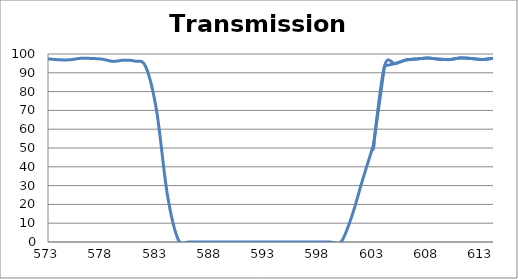
| Category | Transmission (%) |
|---|---|
| 2600.0 | 88.464 |
| 2599.0 | 88.485 |
| 2598.0 | 88.47 |
| 2597.0 | 88.44 |
| 2596.0 | 88.397 |
| 2595.0 | 88.304 |
| 2594.0 | 88.188 |
| 2593.0 | 88.125 |
| 2592.0 | 87.924 |
| 2591.0 | 87.725 |
| 2590.0 | 87.551 |
| 2589.0 | 87.424 |
| 2588.0 | 87.231 |
| 2587.0 | 87.037 |
| 2586.0 | 86.767 |
| 2585.0 | 86.582 |
| 2584.0 | 86.371 |
| 2583.0 | 86.162 |
| 2582.0 | 85.904 |
| 2581.0 | 85.711 |
| 2580.0 | 85.522 |
| 2579.0 | 85.347 |
| 2578.0 | 85.222 |
| 2577.0 | 85.022 |
| 2576.0 | 84.879 |
| 2575.0 | 84.786 |
| 2574.0 | 84.687 |
| 2573.0 | 84.596 |
| 2572.0 | 84.533 |
| 2571.0 | 84.469 |
| 2570.0 | 84.497 |
| 2569.0 | 84.521 |
| 2568.0 | 84.594 |
| 2567.0 | 84.698 |
| 2566.0 | 84.796 |
| 2565.0 | 84.958 |
| 2564.0 | 85.135 |
| 2563.0 | 85.333 |
| 2562.0 | 85.531 |
| 2561.0 | 85.71 |
| 2560.0 | 85.964 |
| 2559.0 | 86.209 |
| 2558.0 | 86.467 |
| 2557.0 | 86.714 |
| 2556.0 | 86.943 |
| 2555.0 | 87.203 |
| 2554.0 | 87.513 |
| 2553.0 | 87.805 |
| 2552.0 | 88.109 |
| 2551.0 | 88.415 |
| 2550.0 | 88.728 |
| 2549.0 | 89.023 |
| 2548.0 | 89.324 |
| 2547.0 | 89.566 |
| 2546.0 | 89.78 |
| 2545.0 | 89.955 |
| 2544.0 | 90.058 |
| 2543.0 | 90.173 |
| 2542.0 | 90.222 |
| 2541.0 | 90.188 |
| 2540.0 | 90.121 |
| 2539.0 | 90.014 |
| 2538.0 | 89.876 |
| 2537.0 | 89.689 |
| 2536.0 | 89.462 |
| 2535.0 | 89.143 |
| 2534.0 | 88.819 |
| 2533.0 | 88.51 |
| 2532.0 | 88.196 |
| 2531.0 | 87.824 |
| 2530.0 | 87.352 |
| 2529.0 | 86.969 |
| 2528.0 | 86.607 |
| 2527.0 | 86.205 |
| 2526.0 | 85.827 |
| 2525.0 | 85.366 |
| 2524.0 | 84.939 |
| 2523.0 | 84.605 |
| 2522.0 | 84.263 |
| 2521.0 | 83.888 |
| 2520.0 | 83.534 |
| 2519.0 | 83.224 |
| 2518.0 | 82.944 |
| 2517.0 | 82.735 |
| 2516.0 | 82.552 |
| 2515.0 | 82.402 |
| 2514.0 | 82.27 |
| 2513.0 | 82.218 |
| 2512.0 | 82.195 |
| 2511.0 | 82.241 |
| 2510.0 | 82.333 |
| 2509.0 | 82.436 |
| 2508.0 | 82.61 |
| 2507.0 | 82.794 |
| 2506.0 | 83.057 |
| 2505.0 | 83.388 |
| 2504.0 | 83.718 |
| 2503.0 | 84.05 |
| 2502.0 | 84.407 |
| 2501.0 | 84.802 |
| 2500.0 | 85.188 |
| 2499.0 | 85.576 |
| 2498.0 | 85.958 |
| 2497.0 | 86.379 |
| 2496.0 | 86.757 |
| 2495.0 | 87.116 |
| 2494.0 | 87.455 |
| 2493.0 | 87.752 |
| 2492.0 | 87.957 |
| 2491.0 | 88.143 |
| 2490.0 | 88.297 |
| 2489.0 | 88.428 |
| 2488.0 | 88.496 |
| 2487.0 | 88.471 |
| 2486.0 | 88.348 |
| 2485.0 | 88.205 |
| 2484.0 | 88.03 |
| 2483.0 | 87.769 |
| 2482.0 | 87.436 |
| 2481.0 | 87.046 |
| 2480.0 | 86.631 |
| 2479.0 | 86.167 |
| 2478.0 | 85.638 |
| 2477.0 | 85.081 |
| 2476.0 | 84.497 |
| 2475.0 | 83.854 |
| 2474.0 | 83.224 |
| 2473.0 | 82.598 |
| 2472.0 | 81.976 |
| 2471.0 | 81.372 |
| 2470.0 | 80.773 |
| 2469.0 | 80.189 |
| 2468.0 | 79.682 |
| 2467.0 | 79.242 |
| 2466.0 | 78.821 |
| 2465.0 | 78.436 |
| 2464.0 | 78.088 |
| 2463.0 | 77.814 |
| 2462.0 | 77.618 |
| 2461.0 | 77.469 |
| 2460.0 | 77.356 |
| 2459.0 | 77.342 |
| 2458.0 | 77.398 |
| 2457.0 | 77.495 |
| 2456.0 | 77.644 |
| 2455.0 | 77.859 |
| 2454.0 | 78.117 |
| 2453.0 | 78.423 |
| 2452.0 | 78.778 |
| 2451.0 | 79.208 |
| 2450.0 | 79.658 |
| 2449.0 | 80.148 |
| 2448.0 | 80.663 |
| 2447.0 | 81.181 |
| 2446.0 | 81.68 |
| 2445.0 | 82.205 |
| 2444.0 | 82.725 |
| 2443.0 | 83.223 |
| 2442.0 | 83.706 |
| 2441.0 | 84.118 |
| 2440.0 | 84.47 |
| 2439.0 | 84.77 |
| 2438.0 | 85.023 |
| 2437.0 | 85.181 |
| 2436.0 | 85.235 |
| 2435.0 | 85.198 |
| 2434.0 | 85.086 |
| 2433.0 | 84.897 |
| 2432.0 | 84.589 |
| 2431.0 | 84.168 |
| 2430.0 | 83.64 |
| 2429.0 | 83.044 |
| 2428.0 | 82.402 |
| 2427.0 | 81.683 |
| 2426.0 | 80.899 |
| 2425.0 | 80.036 |
| 2424.0 | 79.166 |
| 2423.0 | 78.289 |
| 2422.0 | 77.414 |
| 2421.0 | 76.537 |
| 2420.0 | 75.643 |
| 2419.0 | 74.762 |
| 2418.0 | 73.923 |
| 2417.0 | 73.13 |
| 2416.0 | 72.426 |
| 2415.0 | 71.773 |
| 2414.0 | 71.183 |
| 2413.0 | 70.653 |
| 2412.0 | 70.184 |
| 2411.0 | 69.8 |
| 2410.0 | 69.505 |
| 2409.0 | 69.296 |
| 2408.0 | 69.161 |
| 2407.0 | 69.105 |
| 2406.0 | 69.133 |
| 2405.0 | 69.242 |
| 2404.0 | 69.441 |
| 2403.0 | 69.718 |
| 2402.0 | 70.106 |
| 2401.0 | 70.578 |
| 2400.0 | 71.14 |
| 2399.0 | 71.807 |
| 2398.0 | 72.537 |
| 2397.0 | 73.348 |
| 2396.0 | 74.207 |
| 2395.0 | 75.11 |
| 2394.0 | 76.12 |
| 2393.0 | 77.199 |
| 2392.0 | 78.244 |
| 2391.0 | 79.277 |
| 2390.0 | 80.32 |
| 2389.0 | 81.364 |
| 2388.0 | 82.415 |
| 2387.0 | 83.409 |
| 2386.0 | 84.32 |
| 2385.0 | 85.158 |
| 2384.0 | 85.929 |
| 2383.0 | 86.563 |
| 2382.0 | 87.062 |
| 2381.0 | 87.432 |
| 2380.0 | 87.644 |
| 2379.0 | 87.724 |
| 2378.0 | 87.695 |
| 2377.0 | 87.541 |
| 2376.0 | 87.282 |
| 2375.0 | 86.941 |
| 2374.0 | 86.428 |
| 2373.0 | 85.798 |
| 2372.0 | 85.106 |
| 2371.0 | 84.396 |
| 2370.0 | 83.642 |
| 2369.0 | 82.818 |
| 2368.0 | 81.99 |
| 2367.0 | 81.183 |
| 2366.0 | 80.345 |
| 2365.0 | 79.538 |
| 2364.0 | 78.75 |
| 2363.0 | 77.999 |
| 2362.0 | 77.304 |
| 2361.0 | 76.697 |
| 2360.0 | 76.131 |
| 2359.0 | 75.658 |
| 2358.0 | 75.26 |
| 2357.0 | 74.905 |
| 2356.0 | 74.655 |
| 2355.0 | 74.513 |
| 2354.0 | 74.465 |
| 2353.0 | 74.511 |
| 2352.0 | 74.618 |
| 2351.0 | 74.775 |
| 2350.0 | 75.01 |
| 2349.0 | 75.335 |
| 2348.0 | 75.75 |
| 2347.0 | 76.223 |
| 2346.0 | 76.753 |
| 2345.0 | 77.278 |
| 2344.0 | 77.821 |
| 2343.0 | 78.415 |
| 2342.0 | 79.02 |
| 2341.0 | 79.59 |
| 2340.0 | 80.153 |
| 2339.0 | 80.659 |
| 2338.0 | 81.136 |
| 2337.0 | 81.596 |
| 2336.0 | 81.988 |
| 2335.0 | 82.268 |
| 2334.0 | 82.452 |
| 2333.0 | 82.567 |
| 2332.0 | 82.602 |
| 2331.0 | 82.574 |
| 2330.0 | 82.463 |
| 2329.0 | 82.256 |
| 2328.0 | 81.959 |
| 2327.0 | 81.592 |
| 2326.0 | 81.14 |
| 2325.0 | 80.664 |
| 2324.0 | 80.138 |
| 2323.0 | 79.569 |
| 2322.0 | 78.981 |
| 2321.0 | 78.415 |
| 2320.0 | 77.814 |
| 2319.0 | 77.255 |
| 2318.0 | 76.711 |
| 2317.0 | 76.196 |
| 2316.0 | 75.737 |
| 2315.0 | 75.332 |
| 2314.0 | 75.002 |
| 2313.0 | 74.767 |
| 2312.0 | 74.583 |
| 2311.0 | 74.462 |
| 2310.0 | 74.442 |
| 2309.0 | 74.516 |
| 2308.0 | 74.676 |
| 2307.0 | 74.904 |
| 2306.0 | 75.263 |
| 2305.0 | 75.66 |
| 2304.0 | 76.136 |
| 2303.0 | 76.691 |
| 2302.0 | 77.288 |
| 2301.0 | 77.929 |
| 2300.0 | 78.618 |
| 2299.0 | 79.316 |
| 2298.0 | 80.049 |
| 2297.0 | 80.817 |
| 2296.0 | 81.533 |
| 2295.0 | 82.192 |
| 2294.0 | 82.839 |
| 2293.0 | 83.408 |
| 2292.0 | 83.931 |
| 2291.0 | 84.346 |
| 2290.0 | 84.691 |
| 2289.0 | 84.943 |
| 2288.0 | 85.095 |
| 2287.0 | 85.112 |
| 2286.0 | 85.007 |
| 2285.0 | 84.797 |
| 2284.0 | 84.459 |
| 2283.0 | 84.022 |
| 2282.0 | 83.467 |
| 2281.0 | 82.881 |
| 2280.0 | 82.2 |
| 2279.0 | 81.52 |
| 2278.0 | 80.764 |
| 2277.0 | 79.99 |
| 2276.0 | 79.198 |
| 2275.0 | 78.457 |
| 2274.0 | 77.73 |
| 2273.0 | 77.066 |
| 2272.0 | 76.432 |
| 2271.0 | 75.886 |
| 2270.0 | 75.422 |
| 2269.0 | 75.066 |
| 2268.0 | 74.848 |
| 2267.0 | 74.685 |
| 2266.0 | 74.631 |
| 2265.0 | 74.695 |
| 2264.0 | 74.867 |
| 2263.0 | 75.139 |
| 2262.0 | 75.567 |
| 2261.0 | 76.061 |
| 2260.0 | 76.661 |
| 2259.0 | 77.307 |
| 2258.0 | 78.117 |
| 2257.0 | 78.997 |
| 2256.0 | 79.951 |
| 2255.0 | 80.839 |
| 2254.0 | 81.788 |
| 2253.0 | 82.69 |
| 2252.0 | 83.646 |
| 2251.0 | 84.548 |
| 2250.0 | 85.356 |
| 2249.0 | 86.131 |
| 2248.0 | 86.785 |
| 2247.0 | 87.272 |
| 2246.0 | 87.611 |
| 2245.0 | 87.855 |
| 2244.0 | 87.843 |
| 2243.0 | 87.635 |
| 2242.0 | 87.203 |
| 2241.0 | 86.62 |
| 2240.0 | 85.823 |
| 2239.0 | 84.898 |
| 2238.0 | 83.755 |
| 2237.0 | 82.565 |
| 2236.0 | 81.251 |
| 2235.0 | 79.835 |
| 2234.0 | 78.389 |
| 2233.0 | 76.888 |
| 2232.0 | 75.421 |
| 2231.0 | 73.97 |
| 2230.0 | 72.505 |
| 2229.0 | 71.239 |
| 2228.0 | 69.948 |
| 2227.0 | 68.829 |
| 2226.0 | 67.74 |
| 2225.0 | 66.785 |
| 2224.0 | 65.935 |
| 2223.0 | 65.203 |
| 2222.0 | 64.607 |
| 2221.0 | 64.141 |
| 2220.0 | 63.739 |
| 2219.0 | 63.515 |
| 2218.0 | 63.354 |
| 2217.0 | 63.296 |
| 2216.0 | 63.371 |
| 2215.0 | 63.528 |
| 2214.0 | 63.772 |
| 2213.0 | 64.023 |
| 2212.0 | 64.4 |
| 2211.0 | 64.785 |
| 2210.0 | 65.258 |
| 2209.0 | 65.748 |
| 2208.0 | 66.248 |
| 2207.0 | 66.811 |
| 2206.0 | 67.321 |
| 2205.0 | 67.815 |
| 2204.0 | 68.26 |
| 2203.0 | 68.665 |
| 2202.0 | 68.989 |
| 2201.0 | 69.21 |
| 2200.0 | 69.336 |
| 2199.0 | 69.386 |
| 2198.0 | 69.325 |
| 2197.0 | 69.178 |
| 2196.0 | 68.917 |
| 2195.0 | 68.614 |
| 2194.0 | 68.184 |
| 2193.0 | 67.659 |
| 2192.0 | 67.049 |
| 2191.0 | 66.509 |
| 2190.0 | 65.877 |
| 2189.0 | 65.238 |
| 2188.0 | 64.583 |
| 2187.0 | 64.007 |
| 2186.0 | 63.463 |
| 2185.0 | 62.947 |
| 2184.0 | 62.517 |
| 2183.0 | 62.168 |
| 2182.0 | 61.901 |
| 2181.0 | 61.738 |
| 2180.0 | 61.645 |
| 2179.0 | 61.677 |
| 2178.0 | 61.81 |
| 2177.0 | 62.071 |
| 2176.0 | 62.423 |
| 2175.0 | 62.846 |
| 2174.0 | 63.42 |
| 2173.0 | 64.119 |
| 2172.0 | 64.88 |
| 2171.0 | 65.696 |
| 2170.0 | 66.644 |
| 2169.0 | 67.671 |
| 2168.0 | 68.804 |
| 2167.0 | 70.004 |
| 2166.0 | 71.179 |
| 2165.0 | 72.308 |
| 2164.0 | 73.485 |
| 2163.0 | 74.647 |
| 2162.0 | 75.714 |
| 2161.0 | 76.719 |
| 2160.0 | 77.64 |
| 2159.0 | 78.305 |
| 2158.0 | 78.872 |
| 2157.0 | 79.228 |
| 2156.0 | 79.385 |
| 2155.0 | 79.361 |
| 2154.0 | 79.077 |
| 2153.0 | 78.631 |
| 2152.0 | 78.013 |
| 2151.0 | 77.246 |
| 2150.0 | 76.356 |
| 2149.0 | 75.32 |
| 2148.0 | 74.233 |
| 2147.0 | 73.086 |
| 2146.0 | 71.948 |
| 2145.0 | 70.867 |
| 2144.0 | 69.804 |
| 2143.0 | 68.783 |
| 2142.0 | 67.808 |
| 2141.0 | 67.013 |
| 2140.0 | 66.268 |
| 2139.0 | 65.641 |
| 2138.0 | 65.129 |
| 2137.0 | 64.749 |
| 2136.0 | 64.523 |
| 2135.0 | 64.38 |
| 2134.0 | 64.384 |
| 2133.0 | 64.554 |
| 2132.0 | 64.84 |
| 2131.0 | 65.25 |
| 2130.0 | 65.775 |
| 2129.0 | 66.478 |
| 2128.0 | 67.327 |
| 2127.0 | 68.239 |
| 2126.0 | 69.282 |
| 2125.0 | 70.409 |
| 2124.0 | 71.738 |
| 2123.0 | 73.183 |
| 2122.0 | 74.623 |
| 2121.0 | 76.18 |
| 2120.0 | 77.819 |
| 2119.0 | 79.474 |
| 2118.0 | 81.251 |
| 2117.0 | 82.905 |
| 2116.0 | 84.609 |
| 2115.0 | 86.247 |
| 2114.0 | 87.874 |
| 2113.0 | 89.244 |
| 2112.0 | 90.592 |
| 2111.0 | 91.783 |
| 2110.0 | 92.844 |
| 2109.0 | 93.737 |
| 2108.0 | 94.411 |
| 2107.0 | 94.983 |
| 2106.0 | 95.381 |
| 2105.0 | 95.605 |
| 2104.0 | 95.7 |
| 2103.0 | 95.644 |
| 2102.0 | 95.492 |
| 2101.0 | 95.206 |
| 2100.0 | 94.817 |
| 2099.0 | 94.37 |
| 2098.0 | 93.846 |
| 2097.0 | 93.265 |
| 2096.0 | 92.619 |
| 2095.0 | 91.926 |
| 2094.0 | 91.225 |
| 2093.0 | 90.468 |
| 2092.0 | 89.673 |
| 2091.0 | 88.861 |
| 2090.0 | 88.054 |
| 2089.0 | 87.216 |
| 2088.0 | 86.375 |
| 2087.0 | 85.517 |
| 2086.0 | 84.636 |
| 2085.0 | 83.78 |
| 2084.0 | 82.907 |
| 2083.0 | 82.082 |
| 2082.0 | 81.261 |
| 2081.0 | 80.45 |
| 2080.0 | 79.706 |
| 2079.0 | 78.994 |
| 2078.0 | 78.318 |
| 2077.0 | 77.699 |
| 2076.0 | 77.204 |
| 2075.0 | 76.799 |
| 2074.0 | 76.445 |
| 2073.0 | 76.201 |
| 2072.0 | 76.084 |
| 2071.0 | 76.085 |
| 2070.0 | 76.215 |
| 2069.0 | 76.476 |
| 2068.0 | 76.865 |
| 2067.0 | 77.365 |
| 2066.0 | 78.033 |
| 2065.0 | 78.847 |
| 2064.0 | 79.752 |
| 2063.0 | 80.756 |
| 2062.0 | 81.867 |
| 2061.0 | 83.118 |
| 2060.0 | 84.416 |
| 2059.0 | 85.699 |
| 2058.0 | 87.049 |
| 2057.0 | 88.369 |
| 2056.0 | 89.689 |
| 2055.0 | 90.911 |
| 2054.0 | 91.948 |
| 2053.0 | 92.852 |
| 2052.0 | 93.583 |
| 2051.0 | 94.126 |
| 2050.0 | 94.386 |
| 2049.0 | 94.36 |
| 2048.0 | 94.103 |
| 2047.0 | 93.566 |
| 2046.0 | 92.811 |
| 2045.0 | 91.834 |
| 2044.0 | 90.628 |
| 2043.0 | 89.25 |
| 2042.0 | 87.772 |
| 2041.0 | 86.182 |
| 2040.0 | 84.55 |
| 2039.0 | 82.965 |
| 2038.0 | 81.401 |
| 2037.0 | 79.927 |
| 2036.0 | 78.594 |
| 2035.0 | 77.401 |
| 2034.0 | 76.343 |
| 2033.0 | 75.453 |
| 2032.0 | 74.759 |
| 2031.0 | 74.283 |
| 2030.0 | 73.996 |
| 2029.0 | 73.897 |
| 2028.0 | 74.03 |
| 2027.0 | 74.379 |
| 2026.0 | 74.891 |
| 2025.0 | 75.621 |
| 2024.0 | 76.579 |
| 2023.0 | 77.679 |
| 2022.0 | 78.912 |
| 2021.0 | 80.294 |
| 2020.0 | 81.749 |
| 2019.0 | 83.28 |
| 2018.0 | 84.919 |
| 2017.0 | 86.519 |
| 2016.0 | 88 |
| 2015.0 | 89.428 |
| 2014.0 | 90.745 |
| 2013.0 | 91.863 |
| 2012.0 | 92.717 |
| 2011.0 | 93.302 |
| 2010.0 | 93.619 |
| 2009.0 | 93.683 |
| 2008.0 | 93.443 |
| 2007.0 | 92.93 |
| 2006.0 | 92.179 |
| 2005.0 | 91.227 |
| 2004.0 | 90.109 |
| 2003.0 | 88.853 |
| 2002.0 | 87.551 |
| 2001.0 | 86.195 |
| 2000.0 | 84.854 |
| 1999.0 | 83.598 |
| 1998.0 | 82.419 |
| 1997.0 | 81.396 |
| 1996.0 | 80.523 |
| 1995.0 | 79.816 |
| 1994.0 | 79.292 |
| 1993.0 | 78.95 |
| 1992.0 | 78.808 |
| 1991.0 | 78.866 |
| 1990.0 | 79.093 |
| 1989.0 | 79.497 |
| 1988.0 | 80.064 |
| 1987.0 | 80.785 |
| 1986.0 | 81.596 |
| 1985.0 | 82.513 |
| 1984.0 | 83.482 |
| 1983.0 | 84.467 |
| 1982.0 | 85.423 |
| 1981.0 | 86.315 |
| 1980.0 | 87.087 |
| 1979.0 | 87.729 |
| 1978.0 | 88.201 |
| 1977.0 | 88.466 |
| 1976.0 | 88.496 |
| 1975.0 | 88.292 |
| 1974.0 | 87.862 |
| 1973.0 | 87.221 |
| 1972.0 | 86.366 |
| 1971.0 | 85.363 |
| 1970.0 | 84.23 |
| 1969.0 | 83.006 |
| 1968.0 | 81.76 |
| 1967.0 | 80.399 |
| 1966.0 | 79.092 |
| 1965.0 | 77.887 |
| 1964.0 | 76.716 |
| 1963.0 | 75.655 |
| 1962.0 | 74.726 |
| 1961.0 | 73.907 |
| 1960.0 | 73.295 |
| 1959.0 | 72.832 |
| 1958.0 | 72.533 |
| 1957.0 | 72.431 |
| 1956.0 | 72.484 |
| 1955.0 | 72.692 |
| 1954.0 | 73.055 |
| 1953.0 | 73.58 |
| 1952.0 | 74.235 |
| 1951.0 | 75.049 |
| 1950.0 | 75.888 |
| 1949.0 | 76.838 |
| 1948.0 | 77.792 |
| 1947.0 | 78.752 |
| 1946.0 | 79.666 |
| 1945.0 | 80.599 |
| 1944.0 | 81.446 |
| 1943.0 | 82.152 |
| 1942.0 | 82.78 |
| 1941.0 | 83.287 |
| 1940.0 | 83.657 |
| 1939.0 | 83.891 |
| 1938.0 | 84.023 |
| 1937.0 | 83.986 |
| 1936.0 | 83.911 |
| 1935.0 | 83.769 |
| 1934.0 | 83.606 |
| 1933.0 | 83.403 |
| 1932.0 | 83.188 |
| 1931.0 | 83.005 |
| 1930.0 | 82.847 |
| 1929.0 | 82.741 |
| 1928.0 | 82.733 |
| 1927.0 | 82.783 |
| 1926.0 | 82.944 |
| 1925.0 | 83.234 |
| 1924.0 | 83.56 |
| 1923.0 | 83.988 |
| 1922.0 | 84.513 |
| 1921.0 | 85.089 |
| 1920.0 | 85.737 |
| 1919.0 | 86.398 |
| 1918.0 | 87.074 |
| 1917.0 | 87.66 |
| 1916.0 | 88.177 |
| 1915.0 | 88.597 |
| 1914.0 | 89.036 |
| 1913.0 | 89.379 |
| 1912.0 | 89.555 |
| 1911.0 | 89.594 |
| 1910.0 | 89.545 |
| 1909.0 | 89.432 |
| 1908.0 | 89.138 |
| 1907.0 | 88.795 |
| 1906.0 | 88.299 |
| 1905.0 | 87.787 |
| 1904.0 | 87.352 |
| 1903.0 | 86.936 |
| 1902.0 | 86.588 |
| 1901.0 | 86.219 |
| 1900.0 | 85.977 |
| 1899.0 | 85.78 |
| 1898.0 | 85.671 |
| 1897.0 | 85.703 |
| 1896.0 | 85.874 |
| 1895.0 | 86.005 |
| 1894.0 | 86.246 |
| 1893.0 | 86.597 |
| 1892.0 | 86.946 |
| 1891.0 | 87.291 |
| 1890.0 | 87.647 |
| 1889.0 | 87.909 |
| 1888.0 | 88.168 |
| 1887.0 | 88.286 |
| 1886.0 | 88.285 |
| 1885.0 | 88.056 |
| 1884.0 | 87.655 |
| 1883.0 | 87.147 |
| 1882.0 | 86.433 |
| 1881.0 | 85.498 |
| 1880.0 | 84.605 |
| 1879.0 | 83.518 |
| 1878.0 | 82.42 |
| 1877.0 | 81.162 |
| 1876.0 | 79.956 |
| 1875.0 | 78.699 |
| 1874.0 | 77.61 |
| 1873.0 | 76.505 |
| 1872.0 | 75.676 |
| 1871.0 | 74.836 |
| 1870.0 | 74.302 |
| 1869.0 | 73.931 |
| 1868.0 | 73.822 |
| 1867.0 | 73.947 |
| 1866.0 | 74.262 |
| 1865.0 | 74.757 |
| 1864.0 | 75.374 |
| 1863.0 | 76.145 |
| 1862.0 | 77.024 |
| 1861.0 | 78.15 |
| 1860.0 | 79.163 |
| 1859.0 | 80.288 |
| 1858.0 | 81.398 |
| 1857.0 | 82.308 |
| 1856.0 | 83.158 |
| 1855.0 | 83.867 |
| 1854.0 | 84.311 |
| 1853.0 | 84.538 |
| 1852.0 | 84.54 |
| 1851.0 | 84.306 |
| 1850.0 | 83.871 |
| 1849.0 | 83.1 |
| 1848.0 | 81.925 |
| 1847.0 | 80.542 |
| 1846.0 | 79.159 |
| 1845.0 | 78.007 |
| 1844.0 | 77.037 |
| 1843.0 | 76.078 |
| 1842.0 | 75 |
| 1841.0 | 73.93 |
| 1840.0 | 72.918 |
| 1839.0 | 72.241 |
| 1838.0 | 71.923 |
| 1837.0 | 71.799 |
| 1836.0 | 71.942 |
| 1835.0 | 72.275 |
| 1834.0 | 72.815 |
| 1833.0 | 73.615 |
| 1832.0 | 74.602 |
| 1831.0 | 75.711 |
| 1830.0 | 77.135 |
| 1829.0 | 78.534 |
| 1828.0 | 80.013 |
| 1827.0 | 81.504 |
| 1826.0 | 83.015 |
| 1825.0 | 84.39 |
| 1824.0 | 85.407 |
| 1823.0 | 86.26 |
| 1822.0 | 86.771 |
| 1821.0 | 87.116 |
| 1820.0 | 87.078 |
| 1819.0 | 86.768 |
| 1818.0 | 86.217 |
| 1817.0 | 85.603 |
| 1816.0 | 84.776 |
| 1815.0 | 83.703 |
| 1814.0 | 82.666 |
| 1813.0 | 81.608 |
| 1812.0 | 80.609 |
| 1811.0 | 79.594 |
| 1810.0 | 78.755 |
| 1809.0 | 78.02 |
| 1808.0 | 77.535 |
| 1807.0 | 77.249 |
| 1806.0 | 77.165 |
| 1805.0 | 77.198 |
| 1804.0 | 77.407 |
| 1803.0 | 77.812 |
| 1802.0 | 78.375 |
| 1801.0 | 79.112 |
| 1800.0 | 79.948 |
| 1799.0 | 80.83 |
| 1798.0 | 81.749 |
| 1797.0 | 82.731 |
| 1796.0 | 83.659 |
| 1795.0 | 84.51 |
| 1794.0 | 85.17 |
| 1793.0 | 85.751 |
| 1792.0 | 86.181 |
| 1791.0 | 86.49 |
| 1790.0 | 86.65 |
| 1789.0 | 86.672 |
| 1788.0 | 86.521 |
| 1787.0 | 86.32 |
| 1786.0 | 86.088 |
| 1785.0 | 85.777 |
| 1784.0 | 85.488 |
| 1783.0 | 85.193 |
| 1782.0 | 84.907 |
| 1781.0 | 84.719 |
| 1780.0 | 84.579 |
| 1779.0 | 84.464 |
| 1778.0 | 84.371 |
| 1777.0 | 84.328 |
| 1776.0 | 84.257 |
| 1775.0 | 84.18 |
| 1774.0 | 84.057 |
| 1773.0 | 83.879 |
| 1772.0 | 83.62 |
| 1771.0 | 83.275 |
| 1770.0 | 82.823 |
| 1769.0 | 82.269 |
| 1768.0 | 81.69 |
| 1767.0 | 80.977 |
| 1766.0 | 80.227 |
| 1765.0 | 79.402 |
| 1764.0 | 78.603 |
| 1763.0 | 77.821 |
| 1762.0 | 77.099 |
| 1761.0 | 76.465 |
| 1760.0 | 75.903 |
| 1759.0 | 75.48 |
| 1758.0 | 75.249 |
| 1757.0 | 75.186 |
| 1756.0 | 75.291 |
| 1755.0 | 75.538 |
| 1754.0 | 75.919 |
| 1753.0 | 76.459 |
| 1752.0 | 77.076 |
| 1751.0 | 77.791 |
| 1750.0 | 78.517 |
| 1749.0 | 79.181 |
| 1748.0 | 79.736 |
| 1747.0 | 80.156 |
| 1746.0 | 80.352 |
| 1745.0 | 80.343 |
| 1744.0 | 80.047 |
| 1743.0 | 79.455 |
| 1742.0 | 78.589 |
| 1741.0 | 77.494 |
| 1740.0 | 76.301 |
| 1739.0 | 74.888 |
| 1738.0 | 73.441 |
| 1737.0 | 71.994 |
| 1736.0 | 70.545 |
| 1735.0 | 69.181 |
| 1734.0 | 68.003 |
| 1733.0 | 66.941 |
| 1732.0 | 66.11 |
| 1731.0 | 65.473 |
| 1730.0 | 65.066 |
| 1729.0 | 64.905 |
| 1728.0 | 65.013 |
| 1727.0 | 65.323 |
| 1726.0 | 65.884 |
| 1725.0 | 66.676 |
| 1724.0 | 67.655 |
| 1723.0 | 68.847 |
| 1722.0 | 70.201 |
| 1721.0 | 71.679 |
| 1720.0 | 73.161 |
| 1719.0 | 74.659 |
| 1718.0 | 76.065 |
| 1717.0 | 77.338 |
| 1716.0 | 78.466 |
| 1715.0 | 79.338 |
| 1714.0 | 79.918 |
| 1713.0 | 80.27 |
| 1712.0 | 80.39 |
| 1711.0 | 80.276 |
| 1710.0 | 79.974 |
| 1709.0 | 79.529 |
| 1708.0 | 79.004 |
| 1707.0 | 78.449 |
| 1706.0 | 77.969 |
| 1705.0 | 77.559 |
| 1704.0 | 77.239 |
| 1703.0 | 77.053 |
| 1702.0 | 76.982 |
| 1701.0 | 77.054 |
| 1700.0 | 77.275 |
| 1699.0 | 77.595 |
| 1698.0 | 77.998 |
| 1697.0 | 78.441 |
| 1696.0 | 78.915 |
| 1695.0 | 79.399 |
| 1694.0 | 79.857 |
| 1693.0 | 80.268 |
| 1692.0 | 80.583 |
| 1691.0 | 80.778 |
| 1690.0 | 80.875 |
| 1689.0 | 80.879 |
| 1688.0 | 80.828 |
| 1687.0 | 80.703 |
| 1686.0 | 80.492 |
| 1685.0 | 80.247 |
| 1684.0 | 79.995 |
| 1683.0 | 79.796 |
| 1682.0 | 79.661 |
| 1681.0 | 79.607 |
| 1680.0 | 79.586 |
| 1679.0 | 79.626 |
| 1678.0 | 79.735 |
| 1677.0 | 79.867 |
| 1676.0 | 79.992 |
| 1675.0 | 80.076 |
| 1674.0 | 80.082 |
| 1673.0 | 79.978 |
| 1672.0 | 79.755 |
| 1671.0 | 79.374 |
| 1670.0 | 78.829 |
| 1669.0 | 78.12 |
| 1668.0 | 77.299 |
| 1667.0 | 76.396 |
| 1666.0 | 75.412 |
| 1665.0 | 74.388 |
| 1664.0 | 73.401 |
| 1663.0 | 72.507 |
| 1662.0 | 71.765 |
| 1661.0 | 71.199 |
| 1660.0 | 70.775 |
| 1659.0 | 70.529 |
| 1658.0 | 70.518 |
| 1657.0 | 70.733 |
| 1656.0 | 71.189 |
| 1655.0 | 71.841 |
| 1654.0 | 72.617 |
| 1653.0 | 73.51 |
| 1652.0 | 74.502 |
| 1651.0 | 75.531 |
| 1650.0 | 76.466 |
| 1649.0 | 77.266 |
| 1648.0 | 77.852 |
| 1647.0 | 78.182 |
| 1646.0 | 78.222 |
| 1645.0 | 77.941 |
| 1644.0 | 77.347 |
| 1643.0 | 76.447 |
| 1642.0 | 75.32 |
| 1641.0 | 74.051 |
| 1640.0 | 72.662 |
| 1639.0 | 71.254 |
| 1638.0 | 69.95 |
| 1637.0 | 68.765 |
| 1636.0 | 67.77 |
| 1635.0 | 67.019 |
| 1634.0 | 66.507 |
| 1633.0 | 66.261 |
| 1632.0 | 66.261 |
| 1631.0 | 66.507 |
| 1630.0 | 66.985 |
| 1629.0 | 67.656 |
| 1628.0 | 68.482 |
| 1627.0 | 69.371 |
| 1626.0 | 70.269 |
| 1625.0 | 71.102 |
| 1624.0 | 71.846 |
| 1623.0 | 72.454 |
| 1622.0 | 72.9 |
| 1621.0 | 73.146 |
| 1620.0 | 73.185 |
| 1619.0 | 73.03 |
| 1618.0 | 72.731 |
| 1617.0 | 72.354 |
| 1616.0 | 71.938 |
| 1615.0 | 71.53 |
| 1614.0 | 71.137 |
| 1613.0 | 70.849 |
| 1612.0 | 70.696 |
| 1611.0 | 70.694 |
| 1610.0 | 70.862 |
| 1609.0 | 71.161 |
| 1608.0 | 71.581 |
| 1607.0 | 72.141 |
| 1606.0 | 72.811 |
| 1605.0 | 73.534 |
| 1604.0 | 74.231 |
| 1603.0 | 74.86 |
| 1602.0 | 75.376 |
| 1601.0 | 75.731 |
| 1600.0 | 75.9 |
| 1599.0 | 75.91 |
| 1598.0 | 75.746 |
| 1597.0 | 75.412 |
| 1596.0 | 74.96 |
| 1595.0 | 74.467 |
| 1594.0 | 73.964 |
| 1593.0 | 73.538 |
| 1592.0 | 73.223 |
| 1591.0 | 73.03 |
| 1590.0 | 72.991 |
| 1589.0 | 73.089 |
| 1588.0 | 73.319 |
| 1587.0 | 73.649 |
| 1586.0 | 74 |
| 1585.0 | 74.363 |
| 1584.0 | 74.673 |
| 1583.0 | 74.888 |
| 1582.0 | 74.967 |
| 1581.0 | 74.855 |
| 1580.0 | 74.535 |
| 1579.0 | 74.078 |
| 1578.0 | 73.443 |
| 1577.0 | 72.709 |
| 1576.0 | 71.902 |
| 1575.0 | 71.099 |
| 1574.0 | 70.341 |
| 1573.0 | 69.722 |
| 1572.0 | 69.235 |
| 1571.0 | 68.899 |
| 1570.0 | 68.767 |
| 1569.0 | 68.826 |
| 1568.0 | 69.062 |
| 1567.0 | 69.402 |
| 1566.0 | 69.82 |
| 1565.0 | 70.275 |
| 1564.0 | 70.665 |
| 1563.0 | 70.896 |
| 1562.0 | 70.893 |
| 1561.0 | 70.64 |
| 1560.0 | 70.082 |
| 1559.0 | 69.185 |
| 1558.0 | 67.999 |
| 1557.0 | 66.62 |
| 1556.0 | 65.052 |
| 1555.0 | 63.638 |
| 1554.0 | 62.243 |
| 1553.0 | 61.05 |
| 1552.0 | 60.025 |
| 1551.0 | 59.273 |
| 1550.0 | 58.799 |
| 1549.0 | 58.644 |
| 1548.0 | 58.747 |
| 1547.0 | 59.047 |
| 1546.0 | 59.526 |
| 1545.0 | 60.057 |
| 1544.0 | 60.539 |
| 1543.0 | 60.893 |
| 1542.0 | 60.989 |
| 1541.0 | 60.747 |
| 1540.0 | 60.111 |
| 1539.0 | 59.072 |
| 1538.0 | 57.777 |
| 1537.0 | 56.211 |
| 1536.0 | 54.461 |
| 1535.0 | 52.714 |
| 1534.0 | 51.015 |
| 1533.0 | 49.452 |
| 1532.0 | 48.128 |
| 1531.0 | 47.104 |
| 1530.0 | 46.415 |
| 1529.0 | 46.099 |
| 1528.0 | 46.132 |
| 1527.0 | 46.524 |
| 1526.0 | 47.294 |
| 1525.0 | 48.448 |
| 1524.0 | 49.885 |
| 1523.0 | 51.523 |
| 1522.0 | 53.382 |
| 1521.0 | 55.142 |
| 1520.0 | 56.843 |
| 1519.0 | 58.085 |
| 1518.0 | 58.816 |
| 1517.0 | 58.941 |
| 1516.0 | 58.466 |
| 1515.0 | 57.476 |
| 1514.0 | 56.141 |
| 1513.0 | 54.604 |
| 1512.0 | 52.998 |
| 1511.0 | 51.517 |
| 1510.0 | 50.261 |
| 1509.0 | 49.456 |
| 1508.0 | 48.981 |
| 1507.0 | 48.914 |
| 1506.0 | 49.269 |
| 1505.0 | 49.978 |
| 1504.0 | 51.122 |
| 1503.0 | 52.62 |
| 1502.0 | 54.257 |
| 1501.0 | 55.975 |
| 1500.0 | 57.671 |
| 1499.0 | 59.133 |
| 1498.0 | 60.282 |
| 1497.0 | 61.008 |
| 1496.0 | 61.278 |
| 1495.0 | 61.086 |
| 1494.0 | 60.474 |
| 1493.0 | 59.612 |
| 1492.0 | 58.695 |
| 1491.0 | 57.752 |
| 1490.0 | 56.953 |
| 1489.0 | 56.404 |
| 1488.0 | 56.148 |
| 1487.0 | 56.247 |
| 1486.0 | 56.701 |
| 1485.0 | 57.531 |
| 1484.0 | 58.669 |
| 1483.0 | 60.01 |
| 1482.0 | 61.485 |
| 1481.0 | 62.906 |
| 1480.0 | 64.181 |
| 1479.0 | 65.115 |
| 1478.0 | 65.553 |
| 1477.0 | 65.493 |
| 1476.0 | 64.944 |
| 1475.0 | 64.086 |
| 1474.0 | 62.971 |
| 1473.0 | 61.913 |
| 1472.0 | 60.913 |
| 1471.0 | 60.161 |
| 1470.0 | 59.715 |
| 1469.0 | 59.666 |
| 1468.0 | 60.018 |
| 1467.0 | 60.749 |
| 1466.0 | 61.831 |
| 1465.0 | 63.124 |
| 1464.0 | 64.371 |
| 1463.0 | 65.523 |
| 1462.0 | 66.413 |
| 1461.0 | 66.747 |
| 1460.0 | 66.536 |
| 1459.0 | 65.705 |
| 1458.0 | 64.329 |
| 1457.0 | 62.747 |
| 1456.0 | 60.783 |
| 1455.0 | 58.888 |
| 1454.0 | 57.002 |
| 1453.0 | 55.423 |
| 1452.0 | 54.345 |
| 1451.0 | 53.567 |
| 1450.0 | 53.202 |
| 1449.0 | 53.223 |
| 1448.0 | 53.663 |
| 1447.0 | 54.442 |
| 1446.0 | 55.604 |
| 1445.0 | 56.9 |
| 1444.0 | 58.14 |
| 1443.0 | 59.218 |
| 1442.0 | 60.092 |
| 1441.0 | 60.422 |
| 1440.0 | 60.262 |
| 1439.0 | 59.633 |
| 1438.0 | 58.544 |
| 1437.0 | 57.212 |
| 1436.0 | 55.77 |
| 1435.0 | 54.449 |
| 1434.0 | 53.219 |
| 1433.0 | 52.45 |
| 1432.0 | 51.931 |
| 1431.0 | 51.768 |
| 1430.0 | 51.954 |
| 1429.0 | 52.504 |
| 1428.0 | 53.438 |
| 1427.0 | 54.52 |
| 1426.0 | 55.754 |
| 1425.0 | 56.959 |
| 1424.0 | 58.169 |
| 1423.0 | 59.212 |
| 1422.0 | 60.014 |
| 1421.0 | 60.564 |
| 1420.0 | 60.944 |
| 1419.0 | 61.128 |
| 1418.0 | 61.239 |
| 1417.0 | 61.302 |
| 1416.0 | 61.431 |
| 1415.0 | 61.742 |
| 1414.0 | 62.193 |
| 1413.0 | 62.713 |
| 1412.0 | 63.304 |
| 1411.0 | 64.054 |
| 1410.0 | 64.869 |
| 1409.0 | 65.534 |
| 1408.0 | 65.989 |
| 1407.0 | 66.28 |
| 1406.0 | 66.367 |
| 1405.0 | 66.273 |
| 1404.0 | 65.954 |
| 1403.0 | 65.527 |
| 1402.0 | 65.171 |
| 1401.0 | 64.881 |
| 1400.0 | 64.617 |
| 1399.0 | 64.375 |
| 1398.0 | 64.496 |
| 1397.0 | 64.757 |
| 1396.0 | 65.259 |
| 1395.0 | 65.613 |
| 1394.0 | 65.807 |
| 1393.0 | 65.9 |
| 1392.0 | 65.784 |
| 1391.0 | 65.327 |
| 1390.0 | 64.675 |
| 1389.0 | 63.797 |
| 1388.0 | 62.728 |
| 1387.0 | 61.569 |
| 1386.0 | 60.56 |
| 1385.0 | 59.811 |
| 1384.0 | 59.419 |
| 1383.0 | 59.305 |
| 1382.0 | 59.388 |
| 1381.0 | 59.743 |
| 1380.0 | 60.299 |
| 1379.0 | 60.913 |
| 1378.0 | 61.629 |
| 1377.0 | 62.13 |
| 1376.0 | 62.272 |
| 1375.0 | 61.923 |
| 1374.0 | 61.134 |
| 1373.0 | 60.053 |
| 1372.0 | 58.738 |
| 1371.0 | 57.217 |
| 1370.0 | 55.707 |
| 1369.0 | 54.415 |
| 1368.0 | 53.412 |
| 1367.0 | 52.771 |
| 1366.0 | 52.523 |
| 1365.0 | 52.774 |
| 1364.0 | 53.435 |
| 1363.0 | 54.358 |
| 1362.0 | 55.699 |
| 1361.0 | 57.282 |
| 1360.0 | 58.85 |
| 1359.0 | 60.182 |
| 1358.0 | 61.481 |
| 1357.0 | 62.282 |
| 1356.0 | 62.791 |
| 1355.0 | 62.793 |
| 1354.0 | 62.445 |
| 1353.0 | 61.923 |
| 1352.0 | 61.337 |
| 1351.0 | 60.938 |
| 1350.0 | 60.752 |
| 1349.0 | 60.756 |
| 1348.0 | 60.984 |
| 1347.0 | 61.339 |
| 1346.0 | 61.867 |
| 1345.0 | 62.491 |
| 1344.0 | 63.125 |
| 1343.0 | 63.559 |
| 1342.0 | 63.852 |
| 1341.0 | 63.974 |
| 1340.0 | 63.964 |
| 1339.0 | 63.805 |
| 1338.0 | 63.584 |
| 1337.0 | 63.346 |
| 1336.0 | 63.168 |
| 1335.0 | 63.085 |
| 1334.0 | 63.113 |
| 1333.0 | 63.251 |
| 1332.0 | 63.462 |
| 1331.0 | 63.684 |
| 1330.0 | 63.905 |
| 1329.0 | 64.09 |
| 1328.0 | 64.198 |
| 1327.0 | 64.199 |
| 1326.0 | 64.129 |
| 1325.0 | 63.991 |
| 1324.0 | 63.854 |
| 1323.0 | 63.783 |
| 1322.0 | 63.732 |
| 1321.0 | 63.687 |
| 1320.0 | 63.688 |
| 1319.0 | 63.697 |
| 1318.0 | 63.643 |
| 1317.0 | 63.442 |
| 1316.0 | 63.058 |
| 1315.0 | 62.484 |
| 1314.0 | 61.695 |
| 1313.0 | 60.832 |
| 1312.0 | 59.944 |
| 1311.0 | 59.148 |
| 1310.0 | 58.571 |
| 1309.0 | 58.171 |
| 1308.0 | 58.026 |
| 1307.0 | 58.141 |
| 1306.0 | 58.473 |
| 1305.0 | 58.902 |
| 1304.0 | 59.276 |
| 1303.0 | 59.492 |
| 1302.0 | 59.463 |
| 1301.0 | 59.06 |
| 1300.0 | 58.251 |
| 1299.0 | 57.17 |
| 1298.0 | 55.95 |
| 1297.0 | 54.705 |
| 1296.0 | 53.597 |
| 1295.0 | 52.82 |
| 1294.0 | 52.378 |
| 1293.0 | 52.344 |
| 1292.0 | 52.733 |
| 1291.0 | 53.524 |
| 1290.0 | 54.626 |
| 1289.0 | 55.886 |
| 1288.0 | 57.159 |
| 1287.0 | 58.194 |
| 1286.0 | 58.794 |
| 1285.0 | 58.849 |
| 1284.0 | 58.368 |
| 1283.0 | 57.464 |
| 1282.0 | 56.27 |
| 1281.0 | 55.062 |
| 1280.0 | 54.065 |
| 1279.0 | 53.408 |
| 1278.0 | 53.24 |
| 1277.0 | 53.586 |
| 1276.0 | 54.389 |
| 1275.0 | 55.634 |
| 1274.0 | 57.179 |
| 1273.0 | 58.806 |
| 1272.0 | 60.413 |
| 1271.0 | 61.773 |
| 1270.0 | 62.74 |
| 1269.0 | 63.241 |
| 1268.0 | 63.362 |
| 1267.0 | 63.215 |
| 1266.0 | 62.937 |
| 1265.0 | 62.632 |
| 1264.0 | 62.388 |
| 1263.0 | 62.247 |
| 1262.0 | 62.212 |
| 1261.0 | 62.243 |
| 1260.0 | 62.27 |
| 1259.0 | 62.242 |
| 1258.0 | 62.154 |
| 1257.0 | 62.007 |
| 1256.0 | 61.824 |
| 1255.0 | 61.667 |
| 1254.0 | 61.558 |
| 1253.0 | 61.522 |
| 1252.0 | 61.515 |
| 1251.0 | 61.497 |
| 1250.0 | 61.349 |
| 1249.0 | 60.922 |
| 1248.0 | 60.102 |
| 1247.0 | 58.821 |
| 1246.0 | 57.161 |
| 1245.0 | 55.21 |
| 1244.0 | 53.182 |
| 1243.0 | 51.283 |
| 1242.0 | 49.717 |
| 1241.0 | 48.608 |
| 1240.0 | 48.099 |
| 1239.0 | 48.269 |
| 1238.0 | 49.055 |
| 1237.0 | 50.384 |
| 1236.0 | 52.021 |
| 1235.0 | 53.776 |
| 1234.0 | 55.215 |
| 1233.0 | 56.076 |
| 1232.0 | 56.283 |
| 1231.0 | 55.775 |
| 1230.0 | 54.746 |
| 1229.0 | 53.476 |
| 1228.0 | 52.318 |
| 1227.0 | 51.542 |
| 1226.0 | 51.349 |
| 1225.0 | 51.757 |
| 1224.0 | 52.738 |
| 1223.0 | 54.268 |
| 1222.0 | 56.126 |
| 1221.0 | 58.075 |
| 1220.0 | 59.891 |
| 1219.0 | 61.333 |
| 1218.0 | 62.214 |
| 1217.0 | 62.612 |
| 1216.0 | 62.668 |
| 1215.0 | 62.559 |
| 1214.0 | 62.49 |
| 1213.0 | 62.588 |
| 1212.0 | 62.876 |
| 1211.0 | 63.313 |
| 1210.0 | 63.716 |
| 1209.0 | 63.882 |
| 1208.0 | 63.627 |
| 1207.0 | 62.864 |
| 1206.0 | 61.601 |
| 1205.0 | 60.012 |
| 1204.0 | 58.31 |
| 1203.0 | 56.773 |
| 1202.0 | 55.569 |
| 1201.0 | 54.668 |
| 1200.0 | 54.145 |
| 1199.0 | 53.907 |
| 1198.0 | 53.799 |
| 1197.0 | 53.626 |
| 1196.0 | 53.246 |
| 1195.0 | 52.612 |
| 1194.0 | 51.797 |
| 1193.0 | 51.016 |
| 1192.0 | 50.404 |
| 1191.0 | 50.025 |
| 1190.0 | 49.93 |
| 1189.0 | 49.991 |
| 1188.0 | 50.033 |
| 1187.0 | 49.759 |
| 1186.0 | 48.918 |
| 1185.0 | 47.407 |
| 1184.0 | 45.338 |
| 1183.0 | 42.932 |
| 1182.0 | 40.628 |
| 1181.0 | 38.716 |
| 1180.0 | 37.393 |
| 1179.0 | 36.881 |
| 1178.0 | 37.238 |
| 1177.0 | 38.538 |
| 1176.0 | 40.627 |
| 1175.0 | 43.28 |
| 1174.0 | 46.067 |
| 1173.0 | 48.357 |
| 1172.0 | 49.388 |
| 1171.0 | 48.792 |
| 1170.0 | 46.857 |
| 1169.0 | 44.122 |
| 1168.0 | 41.434 |
| 1167.0 | 39.378 |
| 1166.0 | 38.29 |
| 1165.0 | 38.362 |
| 1164.0 | 39.729 |
| 1163.0 | 42.444 |
| 1162.0 | 46.22 |
| 1161.0 | 50.914 |
| 1160.0 | 55.315 |
| 1159.0 | 58.274 |
| 1158.0 | 59.12 |
| 1157.0 | 57.935 |
| 1156.0 | 55.66 |
| 1155.0 | 53.187 |
| 1154.0 | 51.693 |
| 1153.0 | 51.426 |
| 1152.0 | 52.594 |
| 1151.0 | 55.166 |
| 1150.0 | 58.324 |
| 1149.0 | 61.685 |
| 1148.0 | 64.225 |
| 1147.0 | 65.206 |
| 1146.0 | 64.522 |
| 1145.0 | 62.737 |
| 1144.0 | 60.816 |
| 1143.0 | 59.397 |
| 1142.0 | 58.982 |
| 1141.0 | 59.645 |
| 1140.0 | 61.154 |
| 1139.0 | 62.865 |
| 1138.0 | 64.065 |
| 1137.0 | 64.021 |
| 1136.0 | 62.513 |
| 1135.0 | 59.626 |
| 1134.0 | 56.442 |
| 1133.0 | 53.466 |
| 1132.0 | 51.274 |
| 1131.0 | 50.111 |
| 1130.0 | 50.09 |
| 1129.0 | 50.953 |
| 1128.0 | 52.269 |
| 1127.0 | 53.581 |
| 1126.0 | 54.225 |
| 1125.0 | 53.933 |
| 1124.0 | 52.704 |
| 1123.0 | 50.86 |
| 1122.0 | 49.095 |
| 1121.0 | 48.029 |
| 1120.0 | 47.905 |
| 1119.0 | 48.815 |
| 1118.0 | 50.635 |
| 1117.0 | 53.103 |
| 1116.0 | 55.539 |
| 1115.0 | 57.609 |
| 1114.0 | 58.664 |
| 1113.0 | 58.84 |
| 1112.0 | 58.51 |
| 1111.0 | 58.247 |
| 1110.0 | 58.519 |
| 1109.0 | 59.511 |
| 1108.0 | 60.977 |
| 1107.0 | 62.461 |
| 1106.0 | 63.324 |
| 1105.0 | 63.178 |
| 1104.0 | 62.095 |
| 1103.0 | 60.382 |
| 1102.0 | 58.716 |
| 1101.0 | 57.809 |
| 1100.0 | 57.778 |
| 1099.0 | 58.632 |
| 1098.0 | 59.865 |
| 1097.0 | 60.783 |
| 1096.0 | 60.485 |
| 1095.0 | 58.531 |
| 1094.0 | 55.368 |
| 1093.0 | 51.535 |
| 1092.0 | 48.372 |
| 1091.0 | 46.073 |
| 1090.0 | 45.07 |
| 1089.0 | 45.353 |
| 1088.0 | 46.62 |
| 1087.0 | 48.304 |
| 1086.0 | 49.341 |
| 1085.0 | 48.761 |
| 1084.0 | 46.491 |
| 1083.0 | 42.865 |
| 1082.0 | 39.346 |
| 1081.0 | 36.57 |
| 1080.0 | 35.128 |
| 1079.0 | 35.194 |
| 1078.0 | 36.813 |
| 1077.0 | 39.522 |
| 1076.0 | 42.658 |
| 1075.0 | 45.248 |
| 1074.0 | 45.985 |
| 1073.0 | 44.67 |
| 1072.0 | 41.973 |
| 1071.0 | 39.47 |
| 1070.0 | 38 |
| 1069.0 | 38.097 |
| 1068.0 | 39.988 |
| 1067.0 | 43.738 |
| 1066.0 | 48.741 |
| 1065.0 | 53.749 |
| 1064.0 | 57.03 |
| 1063.0 | 57.722 |
| 1062.0 | 55.918 |
| 1061.0 | 53.313 |
| 1060.0 | 51.221 |
| 1059.0 | 50.668 |
| 1058.0 | 52.012 |
| 1057.0 | 55.097 |
| 1056.0 | 58.881 |
| 1055.0 | 62.421 |
| 1054.0 | 64.111 |
| 1053.0 | 63.552 |
| 1052.0 | 61.366 |
| 1051.0 | 58.749 |
| 1050.0 | 56.618 |
| 1049.0 | 55.495 |
| 1048.0 | 55.282 |
| 1047.0 | 55.129 |
| 1046.0 | 53.939 |
| 1045.0 | 51.198 |
| 1044.0 | 47.068 |
| 1043.0 | 42.23 |
| 1042.0 | 37.99 |
| 1041.0 | 34.514 |
| 1040.0 | 32.254 |
| 1039.0 | 30.999 |
| 1038.0 | 30.368 |
| 1037.0 | 29.937 |
| 1036.0 | 29.506 |
| 1035.0 | 28.772 |
| 1034.0 | 27.823 |
| 1033.0 | 26.824 |
| 1032.0 | 25.985 |
| 1031.0 | 25.596 |
| 1030.0 | 25.615 |
| 1029.0 | 25.912 |
| 1028.0 | 26.237 |
| 1027.0 | 26.391 |
| 1026.0 | 26.242 |
| 1025.0 | 25.859 |
| 1024.0 | 25.422 |
| 1023.0 | 25.131 |
| 1022.0 | 25.166 |
| 1021.0 | 25.623 |
| 1020.0 | 26.421 |
| 1019.0 | 27.365 |
| 1018.0 | 28.261 |
| 1017.0 | 28.991 |
| 1016.0 | 29.373 |
| 1015.0 | 29.661 |
| 1014.0 | 30.1 |
| 1013.0 | 30.968 |
| 1012.0 | 32.458 |
| 1011.0 | 34.686 |
| 1010.0 | 37.497 |
| 1009.0 | 40.59 |
| 1008.0 | 43.668 |
| 1007.0 | 46.404 |
| 1006.0 | 48.72 |
| 1005.0 | 50.845 |
| 1004.0 | 53.436 |
| 1003.0 | 57.045 |
| 1002.0 | 61.537 |
| 1001.0 | 66.983 |
| 1000.0 | 71.922 |
| 999.0 | 75.999 |
| 998.0 | 78.633 |
| 997.0 | 80.015 |
| 996.0 | 80.557 |
| 995.0 | 80.858 |
| 994.0 | 80.864 |
| 993.0 | 80.112 |
| 992.0 | 78.341 |
| 991.0 | 75.571 |
| 990.0 | 72.444 |
| 989.0 | 69.539 |
| 988.0 | 67.645 |
| 987.0 | 67.121 |
| 986.0 | 67.676 |
| 985.0 | 68.95 |
| 984.0 | 70.161 |
| 983.0 | 70.91 |
| 982.0 | 70.957 |
| 981.0 | 70.48 |
| 980.0 | 69.922 |
| 979.0 | 69.606 |
| 978.0 | 69.679 |
| 977.0 | 70.085 |
| 976.0 | 70.643 |
| 975.0 | 71.249 |
| 974.0 | 71.751 |
| 973.0 | 72.334 |
| 972.0 | 73.111 |
| 971.0 | 74.177 |
| 970.0 | 75.532 |
| 969.0 | 77.083 |
| 968.0 | 78.454 |
| 967.0 | 79.477 |
| 966.0 | 80 |
| 965.0 | 80.178 |
| 964.0 | 80.065 |
| 963.0 | 79.761 |
| 962.0 | 79.331 |
| 961.0 | 78.713 |
| 960.0 | 78.009 |
| 959.0 | 77.341 |
| 958.0 | 76.82 |
| 957.0 | 76.518 |
| 956.0 | 76.394 |
| 955.0 | 76.193 |
| 954.0 | 75.84 |
| 953.0 | 75.274 |
| 952.0 | 74.638 |
| 951.0 | 74.182 |
| 950.0 | 74.129 |
| 949.0 | 74.471 |
| 948.0 | 75.029 |
| 947.0 | 75.492 |
| 946.0 | 75.643 |
| 945.0 | 75.501 |
| 944.0 | 75.325 |
| 943.0 | 75.442 |
| 942.0 | 76.044 |
| 941.0 | 77.167 |
| 940.0 | 78.548 |
| 939.0 | 79.815 |
| 938.0 | 80.954 |
| 937.0 | 81.967 |
| 936.0 | 82.875 |
| 935.0 | 83.974 |
| 934.0 | 85.087 |
| 933.0 | 86.162 |
| 932.0 | 86.982 |
| 931.0 | 87.299 |
| 930.0 | 87.252 |
| 929.0 | 87.003 |
| 928.0 | 86.84 |
| 927.0 | 86.879 |
| 926.0 | 86.94 |
| 925.0 | 86.803 |
| 924.0 | 86.278 |
| 923.0 | 85.447 |
| 922.0 | 84.638 |
| 921.0 | 84.121 |
| 920.0 | 84.043 |
| 919.0 | 84.191 |
| 918.0 | 84.251 |
| 917.0 | 83.935 |
| 916.0 | 83.305 |
| 915.0 | 82.641 |
| 914.0 | 82.282 |
| 913.0 | 82.5 |
| 912.0 | 83.258 |
| 911.0 | 84.331 |
| 910.0 | 85.488 |
| 909.0 | 86.537 |
| 908.0 | 87.455 |
| 907.0 | 88.377 |
| 906.0 | 89.309 |
| 905.0 | 90.055 |
| 904.0 | 90.525 |
| 903.0 | 90.713 |
| 902.0 | 90.728 |
| 901.0 | 90.639 |
| 900.0 | 90.536 |
| 899.0 | 90.47 |
| 898.0 | 90.4 |
| 897.0 | 90.362 |
| 896.0 | 90.403 |
| 895.0 | 90.573 |
| 894.0 | 90.922 |
| 893.0 | 91.417 |
| 892.0 | 91.941 |
| 891.0 | 92.322 |
| 890.0 | 92.536 |
| 889.0 | 92.613 |
| 888.0 | 92.644 |
| 887.0 | 92.688 |
| 886.0 | 92.812 |
| 885.0 | 93.008 |
| 884.0 | 93.187 |
| 883.0 | 93.335 |
| 882.0 | 93.462 |
| 881.0 | 93.611 |
| 880.0 | 93.797 |
| 879.0 | 94.032 |
| 878.0 | 94.243 |
| 877.0 | 94.452 |
| 876.0 | 94.704 |
| 875.0 | 94.924 |
| 874.0 | 95.115 |
| 873.0 | 95.311 |
| 872.0 | 95.476 |
| 871.0 | 95.639 |
| 870.0 | 95.801 |
| 869.0 | 95.925 |
| 868.0 | 96.029 |
| 867.0 | 96.115 |
| 866.0 | 96.205 |
| 865.0 | 96.27 |
| 864.0 | 96.319 |
| 863.0 | 96.378 |
| 862.0 | 96.424 |
| 861.0 | 96.462 |
| 860.0 | 96.895 |
| 859.0 | 97.237 |
| 858.0 | 96.859 |
| 857.0 | 96.133 |
| 856.0 | 95.776 |
| 855.0 | 96.184 |
| 854.0 | 96.997 |
| 853.0 | 97.46 |
| 852.0 | 97.343 |
| 851.0 | 96.855 |
| 850.0 | 96.427 |
| 849.0 | 96.681 |
| 848.0 | 97.405 |
| 847.0 | 97.913 |
| 846.0 | 97.776 |
| 845.0 | 97.167 |
| 844.0 | 96.786 |
| 843.0 | 97.053 |
| 842.0 | 97.757 |
| 841.0 | 98.251 |
| 840.0 | 98.096 |
| 839.0 | 97.595 |
| 838.0 | 97.168 |
| 837.0 | 97.207 |
| 836.0 | 97.546 |
| 835.0 | 97.587 |
| 834.0 | 97.268 |
| 833.0 | 96.991 |
| 832.0 | 97.104 |
| 831.0 | 97.683 |
| 830.0 | 98.167 |
| 829.0 | 98.003 |
| 828.0 | 97.292 |
| 827.0 | 96.595 |
| 826.0 | 96.589 |
| 825.0 | 97.398 |
| 824.0 | 98.238 |
| 823.0 | 98.451 |
| 822.0 | 98.023 |
| 821.0 | 97.434 |
| 820.0 | 97.277 |
| 819.0 | 97.819 |
| 818.0 | 98.602 |
| 817.0 | 99.075 |
| 816.0 | 99.129 |
| 815.0 | 99.068 |
| 814.0 | 99.024 |
| 813.0 | 99.109 |
| 812.0 | 99.181 |
| 811.0 | 99.067 |
| 810.0 | 98.09 |
| 809.0 | 97.668 |
| 808.0 | 99.221 |
| 807.0 | 98.804 |
| 806.0 | 98.406 |
| 805.0 | 99.923 |
| 804.0 | 99.965 |
| 803.0 | 98.476 |
| 802.0 | 98.032 |
| 801.0 | 99.298 |
| 800.0 | 98.405 |
| 799.0 | 98.617 |
| 798.0 | 98.066 |
| 797.0 | 98.407 |
| 796.0 | 99.605 |
| 795.0 | 98.336 |
| 794.0 | 98.944 |
| 793.0 | 98.425 |
| 792.0 | 99.34 |
| 791.0 | 98.206 |
| 790.0 | 98.331 |
| 789.0 | 98.112 |
| 788.0 | 98.489 |
| 787.0 | 99.862 |
| 786.0 | 98.112 |
| 785.0 | 97.827 |
| 784.0 | 98.895 |
| 783.0 | 99.136 |
| 782.0 | 99.937 |
| 781.0 | 99.917 |
| 780.0 | 98.949 |
| 779.0 | 98.847 |
| 778.0 | 99.671 |
| 777.0 | 99.095 |
| 776.0 | 99.901 |
| 775.0 | 99.061 |
| 774.0 | 97.518 |
| 773.0 | 99.417 |
| 772.0 | 99.323 |
| 771.0 | 99.126 |
| 770.0 | 99.922 |
| 769.0 | 98.787 |
| 768.0 | 96.899 |
| 767.0 | 98.4 |
| 766.0 | 98.595 |
| 765.0 | 99.639 |
| 764.0 | 99.999 |
| 763.0 | 98.624 |
| 762.0 | 97.562 |
| 761.0 | 97.747 |
| 760.0 | 97.982 |
| 759.0 | 98.598 |
| 758.0 | 99.379 |
| 757.0 | 99.81 |
| 756.0 | 98.651 |
| 755.0 | 99.414 |
| 754.0 | 99.034 |
| 753.0 | 98.651 |
| 752.0 | 98.778 |
| 751.0 | 98.707 |
| 750.0 | 99.031 |
| 749.0 | 98.921 |
| 748.0 | 99.697 |
| 747.0 | 98.623 |
| 746.0 | 99.245 |
| 745.0 | 99.298 |
| 744.0 | 98.384 |
| 743.0 | 98.599 |
| 742.0 | 98.807 |
| 741.0 | 97.65 |
| 740.0 | 98.334 |
| 739.0 | 98.136 |
| 738.0 | 98.484 |
| 737.0 | 99.712 |
| 736.0 | 98.387 |
| 735.0 | 98.168 |
| 734.0 | 99.044 |
| 733.0 | 98.771 |
| 732.0 | 98.377 |
| 731.0 | 99.243 |
| 730.0 | 98.946 |
| 729.0 | 98.798 |
| 728.0 | 99.505 |
| 727.0 | 99.5 |
| 726.0 | 99.473 |
| 725.0 | 99.621 |
| 724.0 | 98.275 |
| 723.0 | 98.538 |
| 722.0 | 99.295 |
| 721.0 | 99.124 |
| 720.0 | 98.817 |
| 719.0 | 99.191 |
| 718.0 | 98.989 |
| 717.0 | 99.002 |
| 716.0 | 99.249 |
| 715.0 | 97.951 |
| 714.0 | 98.594 |
| 713.0 | 99.663 |
| 712.0 | 99.544 |
| 711.0 | 99.386 |
| 710.0 | 99.555 |
| 709.0 | 98.594 |
| 708.0 | 99.382 |
| 707.0 | 99.087 |
| 706.0 | 98.396 |
| 705.0 | 98.73 |
| 704.0 | 99.568 |
| 703.0 | 98.771 |
| 702.0 | 98.353 |
| 701.0 | 98.755 |
| 700.0 | 98.542 |
| 699.0 | 98.651 |
| 698.0 | 98.448 |
| 697.0 | 98.728 |
| 696.0 | 99.133 |
| 695.0 | 99.572 |
| 694.0 | 99.345 |
| 693.0 | 99.032 |
| 692.0 | 99.783 |
| 691.0 | 99.389 |
| 690.0 | 99.5 |
| 689.0 | 99.1 |
| 688.0 | 99.163 |
| 687.0 | 99.498 |
| 686.0 | 98.936 |
| 685.0 | 98.679 |
| 684.0 | 98.479 |
| 683.0 | 98.916 |
| 682.0 | 98.933 |
| 681.0 | 99.106 |
| 680.0 | 98.692 |
| 679.0 | 99.301 |
| 678.0 | 99.541 |
| 677.0 | 99.078 |
| 676.0 | 98.841 |
| 675.0 | 99.54 |
| 674.0 | 99.259 |
| 673.0 | 98.884 |
| 672.0 | 98.926 |
| 671.0 | 99.141 |
| 670.0 | 99.002 |
| 669.0 | 99.182 |
| 668.0 | 98.986 |
| 667.0 | 98.93 |
| 666.0 | 98.962 |
| 665.0 | 99.261 |
| 664.0 | 99.353 |
| 663.0 | 99.124 |
| 662.0 | 98.496 |
| 661.0 | 98.742 |
| 660.0 | 99.043 |
| 659.0 | 99.163 |
| 658.0 | 98.806 |
| 657.0 | 98.928 |
| 656.0 | 98.816 |
| 655.0 | 98.568 |
| 654.0 | 98.579 |
| 653.0 | 99.12 |
| 652.0 | 99.5 |
| 651.0 | 99.619 |
| 650.0 | 98.845 |
| 649.0 | 98.885 |
| 648.0 | 99.209 |
| 647.0 | 99.076 |
| 646.0 | 98.804 |
| 645.0 | 98.914 |
| 644.0 | 99.057 |
| 643.0 | 99.094 |
| 642.0 | 98.857 |
| 641.0 | 98.889 |
| 640.0 | 98.848 |
| 639.0 | 99.015 |
| 638.0 | 98.634 |
| 637.0 | 98.258 |
| 636.0 | 98.771 |
| 635.0 | 98.847 |
| 634.0 | 98.342 |
| 633.0 | 98.457 |
| 632.0 | 98.798 |
| 631.0 | 98.301 |
| 630.0 | 97.916 |
| 629.0 | 98.169 |
| 628.0 | 98.631 |
| 627.0 | 98.193 |
| 626.0 | 97.507 |
| 625.0 | 98.252 |
| 624.0 | 98.814 |
| 623.0 | 98.442 |
| 622.0 | 98.466 |
| 621.0 | 98.26 |
| 620.0 | 97.833 |
| 619.0 | 97.462 |
| 618.0 | 97.28 |
| 617.0 | 97.906 |
| 616.0 | 97.729 |
| 615.0 | 97.574 |
| 614.0 | 97.676 |
| 613.0 | 97.027 |
| 612.0 | 97.608 |
| 611.0 | 97.927 |
| 610.0 | 97.019 |
| 609.0 | 97.259 |
| 608.0 | 97.866 |
| 607.0 | 97.385 |
| 606.0 | 96.873 |
| 605.0 | 94.894 |
| 604.0 | 93.445 |
| 603.0 | 51.804 |
| 602.0 | 33.374 |
| 601.0 | 13.816 |
| 600.0 | 0.011 |
| 599.0 | 0.001 |
| 598.0 | 0 |
| 597.0 | 0 |
| 596.0 | 0 |
| 595.0 | 0 |
| 594.0 | 0 |
| 593.0 | 0 |
| 592.0 | 0 |
| 591.0 | 0 |
| 590.0 | 0 |
| 589.0 | 0 |
| 588.0 | 0 |
| 587.0 | 0.003 |
| 586.0 | 0.043 |
| 585.0 | 1.255 |
| 584.0 | 25.154 |
| 583.0 | 69.963 |
| 582.0 | 93.288 |
| 581.0 | 96.237 |
| 580.0 | 96.711 |
| 579.0 | 96.066 |
| 578.0 | 97.261 |
| 577.0 | 97.635 |
| 576.0 | 97.702 |
| 575.0 | 96.916 |
| 574.0 | 96.921 |
| 573.0 | 97.424 |
| 572.0 | 98.061 |
| 571.0 | 98.013 |
| 570.0 | 97.93 |
| 569.0 | 96.894 |
| 568.0 | 96.69 |
| 567.0 | 97.951 |
| 566.0 | 97.095 |
| 565.0 | 97.457 |
| 564.0 | 98.118 |
| 563.0 | 97.47 |
| 562.0 | 96.947 |
| 561.0 | 97.855 |
| 560.0 | 97.835 |
| 559.0 | 96.833 |
| 558.0 | 97.393 |
| 557.0 | 97.674 |
| 556.0 | 96.716 |
| 555.0 | 96.616 |
| 554.0 | 97.348 |
| 553.0 | 97.703 |
| 552.0 | 97.552 |
| 551.0 | 97.653 |
| 550.0 | 98.231 |
| 549.0 | 98.133 |
| 548.0 | 97.908 |
| 547.0 | 97.28 |
| 546.0 | 97.199 |
| 545.0 | 97.298 |
| 544.0 | 97.28 |
| 543.0 | 98.127 |
| 542.0 | 97.75 |
| 541.0 | 97.949 |
| 540.0 | 97.652 |
| 539.0 | 97.98 |
| 538.0 | 96.736 |
| 537.0 | 97.507 |
| 536.0 | 96.441 |
| 535.0 | 96.438 |
| 534.0 | 96.417 |
| 533.0 | 97.276 |
| 532.0 | 97.766 |
| 531.0 | 97.991 |
| 530.0 | 97.018 |
| 529.0 | 97.713 |
| 528.0 | 97.476 |
| 527.0 | 97.101 |
| 526.0 | 96.987 |
| 525.0 | 97.469 |
| 524.0 | 96.793 |
| 523.0 | 97.552 |
| 522.0 | 97.441 |
| 521.0 | 97.268 |
| 520.0 | 97.473 |
| 519.0 | 97.466 |
| 518.0 | 96.916 |
| 517.0 | 97.405 |
| 516.0 | 96.961 |
| 515.0 | 97.243 |
| 514.0 | 97.565 |
| 513.0 | 97.152 |
| 512.0 | 97.105 |
| 511.0 | 96.965 |
| 510.0 | 97.53 |
| 509.0 | 97.057 |
| 508.0 | 96.824 |
| 507.0 | 97.779 |
| 506.0 | 97.384 |
| 505.0 | 97.971 |
| 504.0 | 98.012 |
| 503.0 | 97.714 |
| 502.0 | 97.12 |
| 501.0 | 97.816 |
| 500.0 | 97.355 |
| 499.0 | 97.25 |
| 498.0 | 97.218 |
| 497.0 | 96.848 |
| 496.0 | 97.152 |
| 495.0 | 96.875 |
| 494.0 | 96.303 |
| 493.0 | 97.452 |
| 492.0 | 96.645 |
| 491.0 | 96.908 |
| 490.0 | 97.197 |
| 489.0 | 97.778 |
| 488.0 | 96.434 |
| 487.0 | 96.7 |
| 486.0 | 96.46 |
| 485.0 | 96.917 |
| 484.0 | 96.751 |
| 483.0 | 97.399 |
| 482.0 | 96.785 |
| 481.0 | 96.575 |
| 480.0 | 96.585 |
| 479.0 | 96.813 |
| 478.0 | 97.568 |
| 477.0 | 96.664 |
| 476.0 | 96.298 |
| 475.0 | 96.967 |
| 474.0 | 96.452 |
| 473.0 | 96.795 |
| 472.0 | 96.98 |
| 471.0 | 95.921 |
| 470.0 | 96.005 |
| 469.0 | 96.999 |
| 468.0 | 97.262 |
| 467.0 | 96.928 |
| 466.0 | 96.719 |
| 465.0 | 96.355 |
| 464.0 | 95.175 |
| 463.0 | 96.151 |
| 462.0 | 95.748 |
| 461.0 | 96.589 |
| 460.0 | 96.479 |
| 459.0 | 96.067 |
| 458.0 | 95.668 |
| 457.0 | 95.752 |
| 456.0 | 96.582 |
| 455.0 | 96.407 |
| 454.0 | 95.431 |
| 453.0 | 95.813 |
| 452.0 | 95.724 |
| 451.0 | 95.991 |
| 450.0 | 95.624 |
| 449.0 | 95.909 |
| 448.0 | 95.695 |
| 447.0 | 96.254 |
| 446.0 | 95.603 |
| 445.0 | 95.617 |
| 444.0 | 95.456 |
| 443.0 | 95.311 |
| 442.0 | 94.948 |
| 441.0 | 93.848 |
| 440.0 | 94.277 |
| 439.0 | 95.571 |
| 438.0 | 95.419 |
| 437.0 | 95.286 |
| 436.0 | 95.197 |
| 435.0 | 94.861 |
| 434.0 | 94.618 |
| 433.0 | 94.535 |
| 432.0 | 94.27 |
| 431.0 | 93.954 |
| 430.0 | 93.782 |
| 429.0 | 93.634 |
| 428.0 | 93.395 |
| 427.0 | 92.893 |
| 426.0 | 92.415 |
| 425.0 | 92.208 |
| 424.0 | 91.859 |
| 423.0 | 91.279 |
| 422.0 | 90.954 |
| 421.0 | 90.671 |
| 420.0 | 89.962 |
| 419.0 | 88.776 |
| 418.0 | 87.042 |
| 417.0 | 84.296 |
| 416.0 | 72.464 |
| 415.0 | 45.932 |
| 414.0 | 17.934 |
| 413.0 | 3.455 |
| 412.0 | 0.22 |
| 411.0 | 0.028 |
| 410.0 | 0.009 |
| 409.0 | 0.002 |
| 408.0 | 0.003 |
| 407.0 | 0.001 |
| 406.0 | 0.001 |
| 405.0 | 0.004 |
| 404.0 | 0.002 |
| 403.0 | 0.003 |
| 402.0 | 0.004 |
| 401.0 | 0.002 |
| 400.0 | 0 |
| 399.0 | 0.004 |
| 398.0 | 0.005 |
| 397.0 | 0.005 |
| 396.0 | 0.005 |
| 395.0 | 0.006 |
| 394.0 | 0.002 |
| 393.0 | 0.004 |
| 392.0 | 0.002 |
| 391.0 | 0.003 |
| 390.0 | 0.005 |
| 389.0 | 0.002 |
| 388.0 | 0.002 |
| 387.0 | 0.004 |
| 386.0 | 0.002 |
| 385.0 | 0.001 |
| 384.0 | 0.004 |
| 383.0 | 0.002 |
| 382.0 | 0.001 |
| 381.0 | 0.004 |
| 380.0 | 0.001 |
| 379.0 | 0.002 |
| 378.0 | 0.004 |
| 377.0 | 0.005 |
| 376.0 | 0.004 |
| 375.0 | 0.002 |
| 374.0 | 0.003 |
| 373.0 | 0.001 |
| 372.0 | 0 |
| 371.0 | 0.004 |
| 370.0 | 0.004 |
| 369.0 | 0.004 |
| 368.0 | 0.004 |
| 367.0 | 0.002 |
| 366.0 | 0 |
| 365.0 | 0.004 |
| 364.0 | 0.005 |
| 363.0 | 0.006 |
| 362.0 | 0.004 |
| 361.0 | 0.002 |
| 360.0 | 0.001 |
| 359.0 | 0.005 |
| 358.0 | 0.006 |
| 357.0 | 0.003 |
| 356.0 | 0.004 |
| 355.0 | 0.002 |
| 354.0 | 0.002 |
| 353.0 | 0.006 |
| 352.0 | 0.005 |
| 351.0 | 0.004 |
| 350.0 | 0.005 |
| 349.0 | 0.002 |
| 348.0 | 0.001 |
| 347.0 | 0.003 |
| 346.0 | 0.006 |
| 345.0 | 0.002 |
| 344.0 | 0.005 |
| 343.0 | 0.003 |
| 342.0 | 0.002 |
| 341.0 | 0.004 |
| 340.0 | 0.006 |
| 339.0 | 0.001 |
| 338.0 | 0.006 |
| 337.0 | 0.001 |
| 336.0 | 0.002 |
| 335.0 | 0.005 |
| 334.0 | 0.007 |
| 333.0 | 0.005 |
| 332.0 | 0.007 |
| 331.0 | 0.002 |
| 330.0 | 0.002 |
| 329.0 | 0.003 |
| 328.0 | 0.005 |
| 327.0 | 0.004 |
| 326.0 | 0.006 |
| 325.0 | 0.001 |
| 324.0 | 0.002 |
| 323.0 | 0.005 |
| 322.0 | 0.007 |
| 321.0 | 0.005 |
| 320.0 | 0.007 |
| 319.0 | 0.001 |
| 318.0 | 0.004 |
| 317.0 | 0.006 |
| 316.0 | 0.005 |
| 315.0 | 0.003 |
| 314.0 | 0.004 |
| 313.0 | 0.001 |
| 312.0 | 0 |
| 311.0 | 0.004 |
| 310.0 | 0.004 |
| 309.0 | 0.003 |
| 308.0 | 0.004 |
| 307.0 | 0.002 |
| 306.0 | 0.001 |
| 305.0 | 0.006 |
| 304.0 | 0.005 |
| 303.0 | 0.005 |
| 302.0 | 0.004 |
| 301.0 | 0.001 |
| 300.0 | 0.001 |
| 299.0 | 0.004 |
| 298.0 | 0.006 |
| 297.0 | 0.002 |
| 296.0 | 0.005 |
| 295.0 | 0.001 |
| 294.0 | 0.002 |
| 293.0 | 0.004 |
| 292.0 | 0.006 |
| 291.0 | 0.001 |
| 290.0 | 0.004 |
| 289.0 | 0.001 |
| 288.0 | 0.002 |
| 287.0 | 0.004 |
| 286.0 | 0.008 |
| 285.0 | 0.001 |
| 284.0 | 0.005 |
| 283.0 | 0 |
| 282.0 | 0.001 |
| 281.0 | 0.005 |
| 280.0 | 0.007 |
| 279.0 | 0.004 |
| 278.0 | 0.008 |
| 277.0 | 0.001 |
| 276.0 | 0.003 |
| 275.0 | 0.005 |
| 274.0 | 0.007 |
| 273.0 | 0.001 |
| 272.0 | 0.006 |
| 271.0 | 0.001 |
| 270.0 | 0.002 |
| 269.0 | 0.005 |
| 268.0 | 0.007 |
| 267.0 | 0.002 |
| 266.0 | 0.003 |
| 265.0 | 0.002 |
| 264.0 | 0.003 |
| 263.0 | 0.007 |
| 262.0 | 0.007 |
| 261.0 | 0.004 |
| 260.0 | 0.006 |
| 259.0 | 0 |
| 258.0 | 0.003 |
| 257.0 | 0.006 |
| 256.0 | 0.006 |
| 255.0 | 0.003 |
| 254.0 | 0.006 |
| 253.0 | 0.002 |
| 252.0 | 0.002 |
| 251.0 | 0.008 |
| 250.0 | 0.005 |
| 249.0 | 0.005 |
| 248.0 | 0.005 |
| 247.0 | 0.001 |
| 246.0 | 0.001 |
| 245.0 | 0.008 |
| 244.0 | 0 |
| 243.0 | 0.007 |
| 242.0 | 0.003 |
| 241.0 | 0.005 |
| 240.0 | 0.006 |
| 239.0 | 0.007 |
| 238.0 | 0.006 |
| 237.0 | 0.008 |
| 236.0 | 0.001 |
| 235.0 | 0.003 |
| 234.0 | 0.006 |
| 233.0 | 0.009 |
| 232.0 | 0.007 |
| 231.0 | 0.004 |
| 230.0 | 0.005 |
| 229.0 | 0.006 |
| 228.0 | 0.004 |
| 227.0 | 0.006 |
| 226.0 | 0.002 |
| 225.0 | 0.007 |
| 224.0 | 0.006 |
| 223.0 | 0.004 |
| 222.0 | 0.002 |
| 221.0 | 0.01 |
| 220.0 | 0.005 |
| 219.0 | 0.006 |
| 218.0 | 0.004 |
| 217.0 | 0.002 |
| 216.0 | 0.003 |
| 215.0 | 0.007 |
| 214.0 | 0.006 |
| 213.0 | 0.004 |
| 212.0 | 0.007 |
| 211.0 | 0.003 |
| 210.0 | 0.004 |
| 209.0 | 0.007 |
| 208.0 | 0.006 |
| 207.0 | 0.005 |
| 206.0 | 0.007 |
| 205.0 | 0.004 |
| 204.0 | 0.006 |
| 203.0 | 0.009 |
| 202.0 | 0.009 |
| 201.0 | 0.008 |